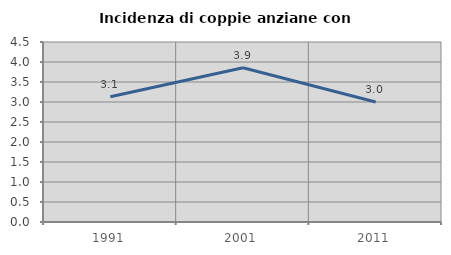
| Category | Incidenza di coppie anziane con figli |
|---|---|
| 1991.0 | 3.13 |
| 2001.0 | 3.857 |
| 2011.0 | 2.999 |